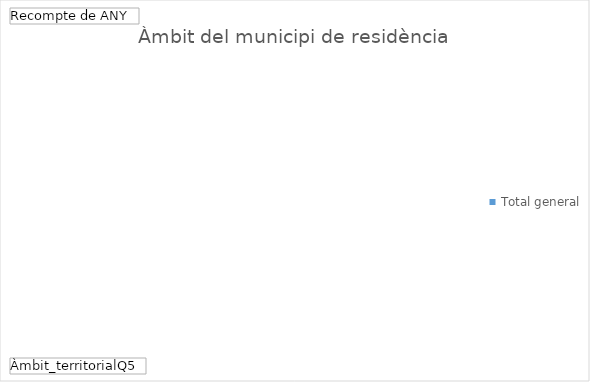
| Category | Total |
|---|---|
| Total general | 0 |